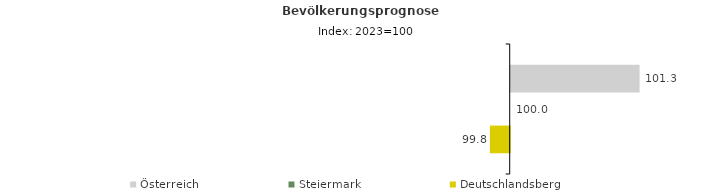
| Category | Österreich | Steiermark | Deutschlandsberg |
|---|---|---|---|
| 2023.0 | 101.3 | 100 | 99.8 |